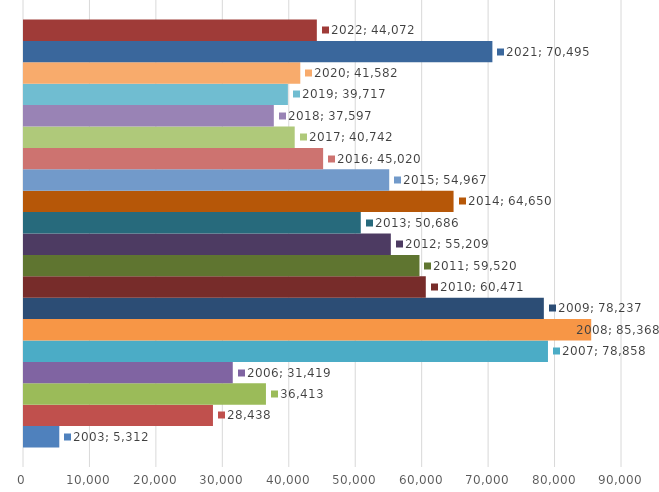
| Category | 2003 | 2004 | 2005 | 2006 | 2007 | 2008 | 2009 | 2010 | 2011 | 2012 | 2013 | 2014 | 2015 | 2016 | 2017 | 2018 | 2019 | 2020 | 2021 | 2022 |
|---|---|---|---|---|---|---|---|---|---|---|---|---|---|---|---|---|---|---|---|---|
| 0 | 5312 | 28438 | 36413 | 31419 | 78858 | 85368 | 78237 | 60471 | 59520 | 55209 | 50686 | 64650 | 54967 | 45020 | 40742 | 37597 | 39717 | 41582 | 70495 | 44072 |